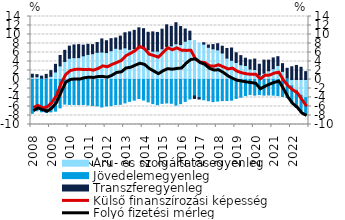
| Category | Áru- és szolgáltatásegyenleg | Jövedelemegyenleg | Transzferegyenleg |
|---|---|---|---|
| 2008.0 | 0.541 | -7.513 | 0.629 |
| 2008.0 | 0.609 | -6.945 | 0.477 |
| 2008.0 | 0.273 | -7.172 | 0.473 |
| 2008.0 | 0.346 | -7.33 | 0.793 |
| 2009.0 | 0.706 | -7.199 | 1.252 |
| 2009.0 | 1.676 | -7.027 | 1.702 |
| 2009.0 | 3.028 | -6.31 | 2.319 |
| 2009.0 | 4.008 | -5.461 | 2.475 |
| 2010.0 | 4.718 | -5.542 | 2.696 |
| 2010.0 | 4.856 | -5.548 | 2.822 |
| 2010.0 | 4.875 | -5.569 | 2.881 |
| 2010.0 | 5.259 | -5.545 | 2.37 |
| 2011.0 | 5.584 | -5.666 | 2.229 |
| 2011.0 | 5.738 | -5.787 | 2.01 |
| 2011.0 | 6.051 | -5.869 | 2.165 |
| 2011.0 | 6.114 | -6.109 | 2.905 |
| 2012.0 | 5.99 | -5.885 | 2.621 |
| 2012.0 | 6.405 | -5.809 | 2.664 |
| 2012.0 | 6.932 | -5.562 | 2.291 |
| 2012.0 | 6.749 | -5.515 | 2.895 |
| 2013.0 | 7.032 | -5.201 | 3.352 |
| 2013.0 | 6.701 | -4.855 | 3.878 |
| 2013.0 | 6.881 | -4.589 | 4.034 |
| 2013.0 | 6.971 | -4.23 | 4.522 |
| 2014.0 | 7.036 | -4.566 | 4.26 |
| 2014.0 | 6.623 | -4.977 | 3.871 |
| 2014.0 | 6.307 | -5.364 | 4.275 |
| 2014.0 | 6.316 | -5.599 | 4.145 |
| 2015.0 | 6.838 | -5.309 | 4.35 |
| 2015.0 | 7.308 | -5.216 | 4.842 |
| 2015.0 | 7.477 | -5.283 | 4.32 |
| 2015.0 | 7.943 | -5.693 | 4.673 |
| 2016.0 | 7.764 | -5.377 | 4.002 |
| 2016.0 | 8.503 | -4.87 | 2.723 |
| 2016.0 | 8.868 | -4.329 | 1.866 |
| 2016.0 | 8.672 | -3.641 | -0.569 |
| 2017.0 | 8.089 | -4.054 | -0.284 |
| 2017.0 | 7.862 | -4.508 | 0.303 |
| 2017.0 | 7.163 | -4.725 | 0.502 |
| 2017.0 | 6.82 | -4.916 | 0.941 |
| 2018.0 | 6.595 | -4.794 | 1.358 |
| 2018.0 | 5.894 | -4.689 | 1.507 |
| 2018.0 | 4.759 | -4.663 | 2.139 |
| 2018.0 | 4.267 | -4.589 | 2.734 |
| 2019.0 | 3.779 | -4.209 | 2.157 |
| 2019.0 | 3.275 | -3.931 | 2.033 |
| 2019.0 | 3.104 | -3.58 | 1.627 |
| 2019.0 | 2.325 | -3.324 | 2.048 |
| 2020.0 | 2.215 | -3.479 | 2.325 |
| 2020.0 | 0.977 | -3.354 | 2.42 |
| 2020.0 | 1.408 | -3.475 | 2.895 |
| 2020.0 | 1.939 | -3.439 | 2.367 |
| 2021.0 | 2.403 | -3.475 | 2.393 |
| 2021.0 | 3.122 | -3.57 | 1.946 |
| 2021.0 | 1.801 | -3.775 | 1.72 |
| 2021.0 | 0.317 | -4.018 | 2.174 |
| 2022.0 | -1.405 | -3.839 | 2.832 |
| 2022.0 | -2.388 | -3.805 | 3.124 |
| 2022.0 | -3.48 | -3.823 | 2.714 |
| 2022.0 | -4.046 | -3.783 | 1.748 |